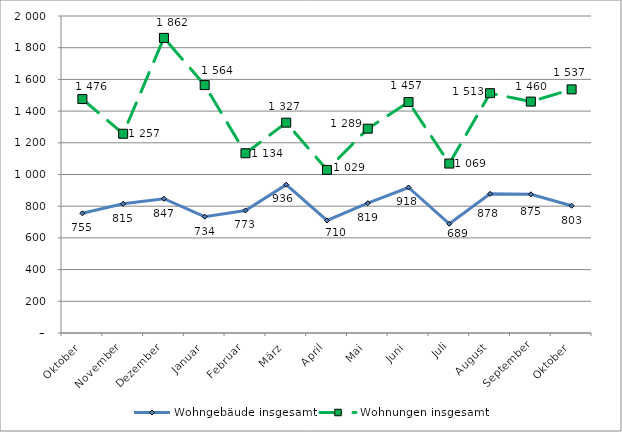
| Category | Wohngebäude insgesamt | Wohnungen insgesamt |
|---|---|---|
| Oktober | 755 | 1476 |
| November | 815 | 1257 |
| Dezember | 847 | 1862 |
| Januar | 734 | 1564 |
| Februar | 773 | 1134 |
| März | 936 | 1327 |
| April | 710 | 1029 |
| Mai | 819 | 1289 |
| Juni | 918 | 1457 |
| Juli | 689 | 1069 |
| August | 878 | 1513 |
| September | 875 | 1460 |
| Oktober | 803 | 1537 |